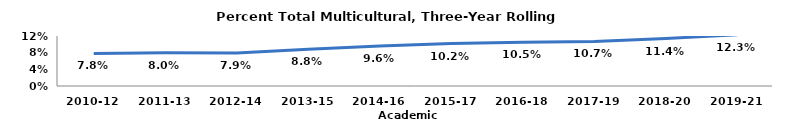
| Category | Series 0 |
|---|---|
| 2010-12 | 0.078 |
| 2011-13 | 0.08 |
| 2012-14 | 0.079 |
| 2013-15 | 0.088 |
| 2014-16 | 0.096 |
| 2015-17 | 0.102 |
| 2016-18 | 0.105 |
| 2017-19 | 0.107 |
| 2018-20 | 0.114 |
| 2019-21 | 0.123 |